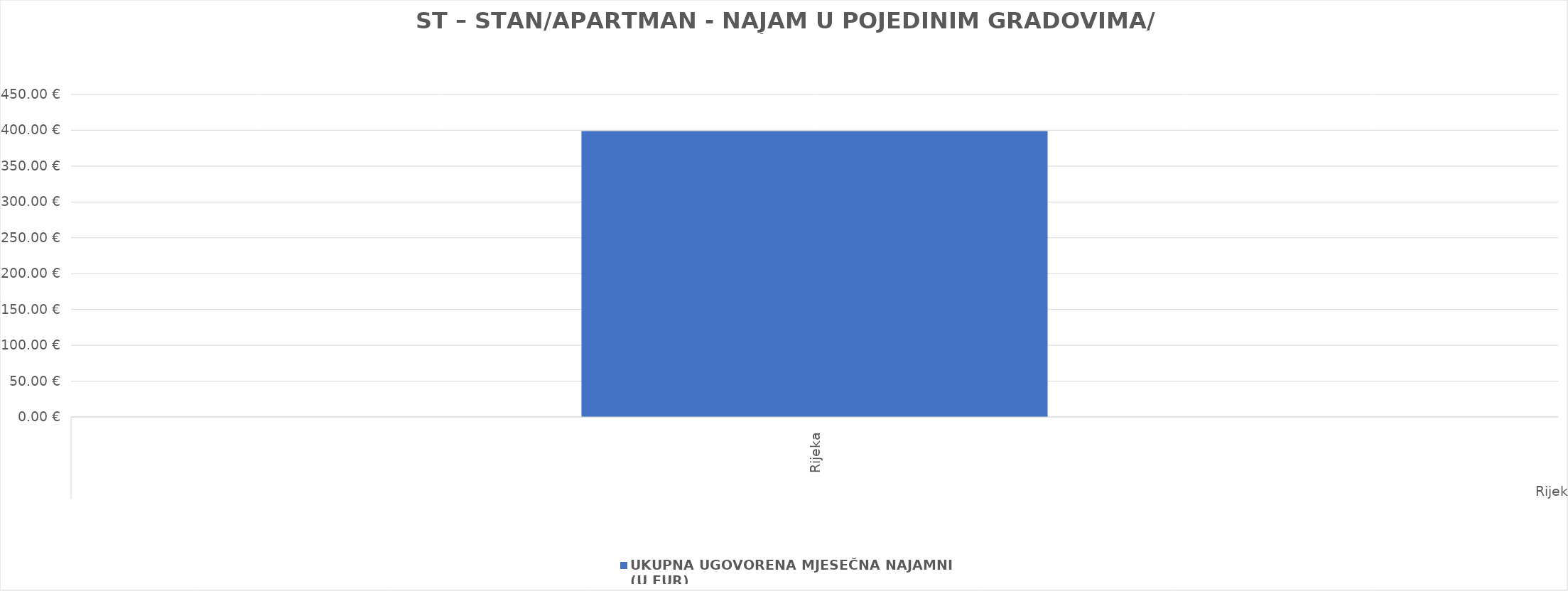
| Category | UKUPNA UGOVORENA MJESEČNA NAJAMNINA 
(U EUR) |
|---|---|
| 0 | 398.88 |